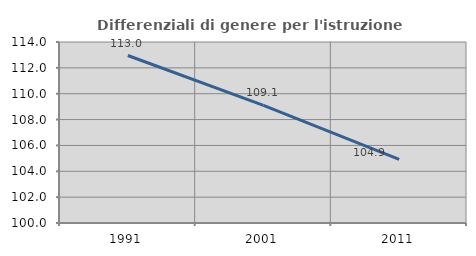
| Category | Differenziali di genere per l'istruzione superiore |
|---|---|
| 1991.0 | 112.955 |
| 2001.0 | 109.102 |
| 2011.0 | 104.924 |